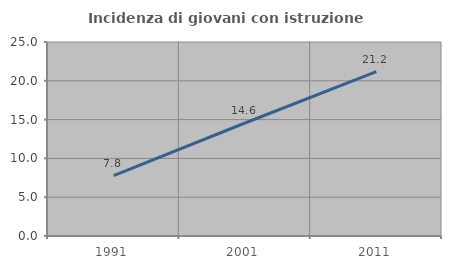
| Category | Incidenza di giovani con istruzione universitaria |
|---|---|
| 1991.0 | 7.792 |
| 2001.0 | 14.563 |
| 2011.0 | 21.176 |